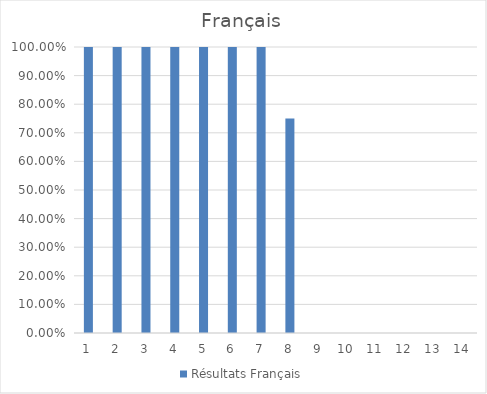
| Category | Résultats Français |
|---|---|
| 0 | 1 |
| 1 | 1 |
| 2 | 1 |
| 3 | 1 |
| 4 | 1 |
| 5 | 1 |
| 6 | 1 |
| 7 | 0.75 |
| 8 | 0 |
| 9 | 0 |
| 10 | 0 |
| 11 | 0 |
| 12 | 0 |
| 13 | 0 |